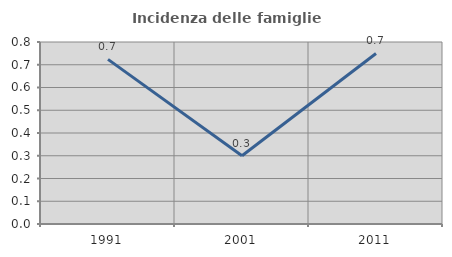
| Category | Incidenza delle famiglie numerose |
|---|---|
| 1991.0 | 0.724 |
| 2001.0 | 0.3 |
| 2011.0 | 0.75 |